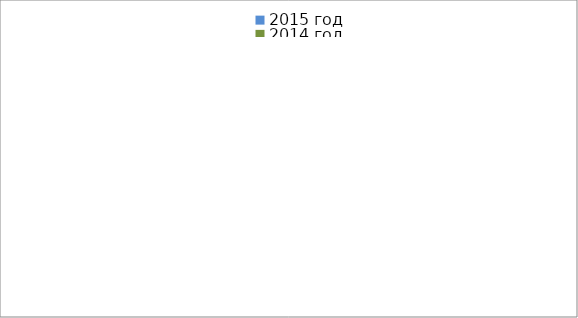
| Category | 2015 год | 2014 год |
|---|---|---|
|  - поджог | 32 | 31 |
|  - неосторожное обращение с огнём | 66 | 47 |
|  - НПТЭ электрооборудования | 10 | 21 |
|  - НПУ и Э печей | 78 | 76 |
|  - НПУ и Э транспортных средств | 54 | 73 |
|   -Шалость с огнем детей | 3 | 1 |
|  -НППБ при эксплуатации эл.приборов | 14 | 21 |
|  - курение | 27 | 22 |
| - прочие | 115 | 112 |
| - не установленные причины | 18 | 10 |